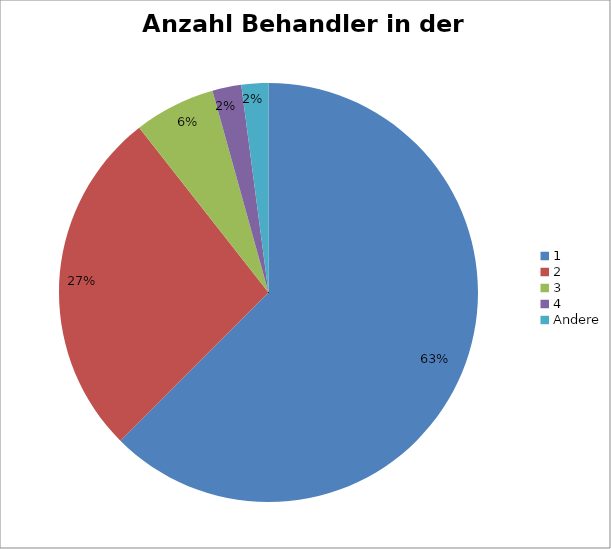
| Category | Series 0 |
|---|---|
| 1 | 10588 |
| 2 | 4561 |
| 3 | 1063 |
| 4 | 378 |
| Andere | 352 |